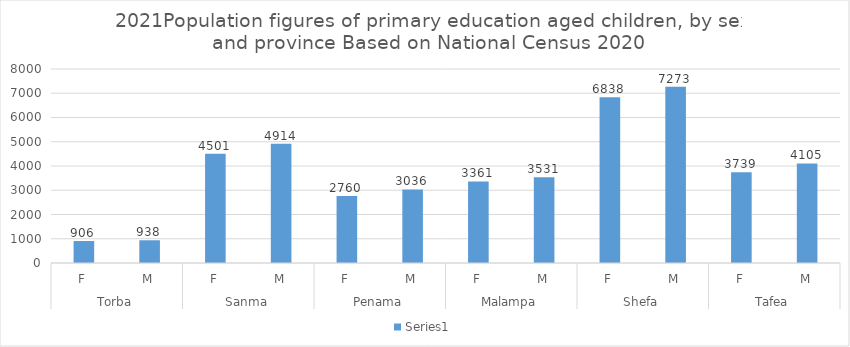
| Category | Series 0 |
|---|---|
| 0 | 905.995 |
| 1 | 937.618 |
| 2 | 4501.409 |
| 3 | 4913.928 |
| 4 | 2759.834 |
| 5 | 3035.837 |
| 6 | 3360.995 |
| 7 | 3531.083 |
| 8 | 6838.043 |
| 9 | 7273.058 |
| 10 | 3739.237 |
| 11 | 4104.99 |